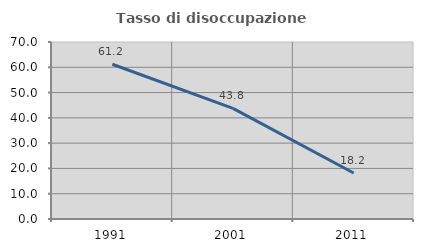
| Category | Tasso di disoccupazione giovanile  |
|---|---|
| 1991.0 | 61.194 |
| 2001.0 | 43.75 |
| 2011.0 | 18.182 |